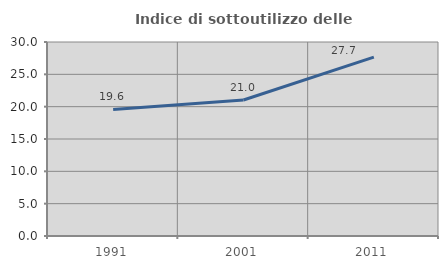
| Category | Indice di sottoutilizzo delle abitazioni  |
|---|---|
| 1991.0 | 19.576 |
| 2001.0 | 21.036 |
| 2011.0 | 27.664 |